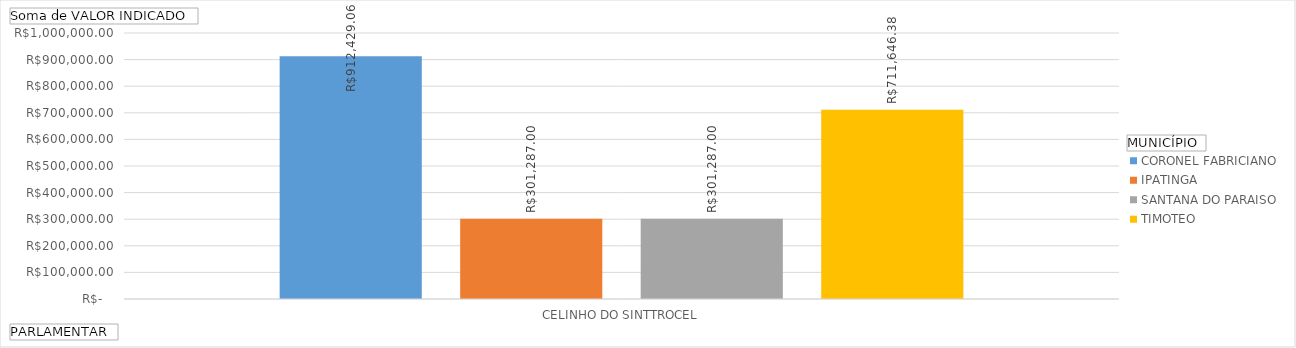
| Category | CORONEL FABRICIANO | IPATINGA | SANTANA DO PARAISO | TIMOTEO |
|---|---|---|---|---|
| CELINHO DO SINTTROCEL | 912429.06 | 301287 | 301287 | 711646.38 |